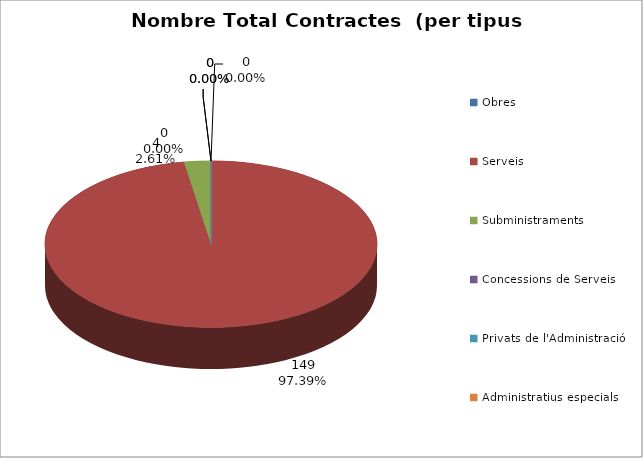
| Category | Nombre Total Contractes |
|---|---|
| Obres | 0 |
| Serveis | 149 |
| Subministraments | 4 |
| Concessions de Serveis | 0 |
| Privats de l'Administració | 0 |
| Administratius especials | 0 |